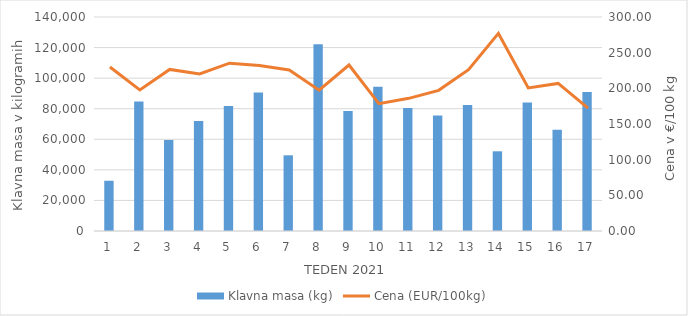
| Category | Klavna masa (kg) |
|---|---|
| 1.0 | 32871 |
| 2.0 | 84639 |
| 3.0 | 59476 |
| 4.0 | 72013 |
| 5.0 | 81759 |
| 6.0 | 90669 |
| 7.0 | 49517 |
| 8.0 | 122111 |
| 9.0 | 78545 |
| 10.0 | 94384 |
| 11.0 | 80405 |
| 12.0 | 75534 |
| 13.0 | 82440 |
| 14.0 | 52143 |
| 15.0 | 84105 |
| 16.0 | 66298 |
| 17.0 | 90925 |